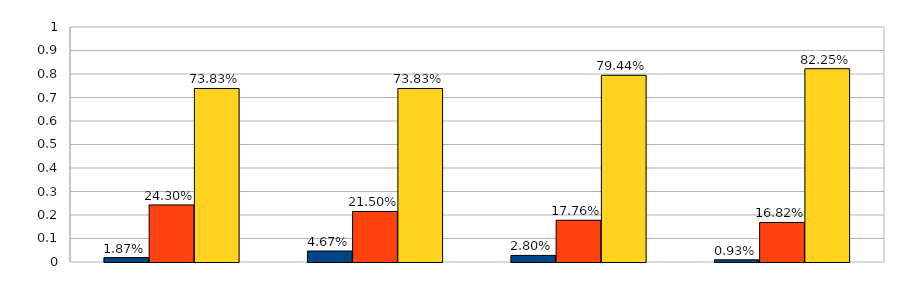
| Category | Series 0 | Series 1 | Series 2 |
|---|---|---|---|
| 0 | 0.019 | 0.243 | 0.738 |
| 1 | 0.047 | 0.215 | 0.738 |
| 2 | 0.028 | 0.178 | 0.794 |
| 3 | 0.009 | 0.168 | 0.822 |